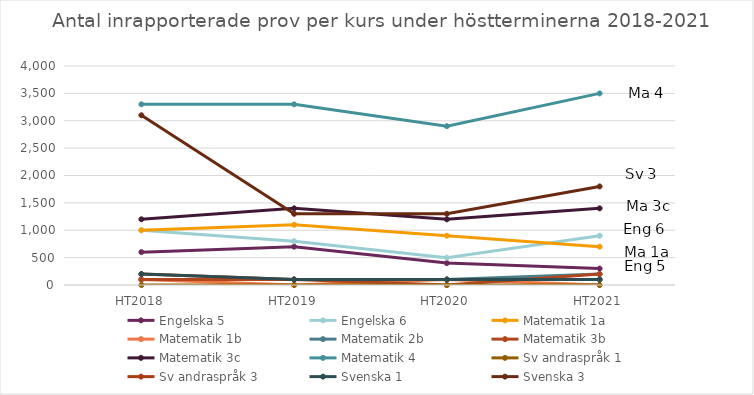
| Category | Engelska 5 | Engelska 6 | Matematik 1a | Matematik 1b | Matematik 2b | Matematik 3b | Matematik 3c | Matematik 4 | Sv andraspråk 1 | Sv andraspråk 3 | Svenska 1 | Svenska 3 |
|---|---|---|---|---|---|---|---|---|---|---|---|---|
| HT2018 | 600 | 1000 | 1000 | 100 | 100 | 100 | 1200 | 3300 | 0 | 200 | 200 | 3100 |
| HT2019 | 700 | 800 | 1100 | 0 | 100 | 100 | 1400 | 3300 | 0 | 100 | 100 | 1300 |
| HT2020 | 400 | 500 | 900 | 100 | 100 | 0 | 1200 | 2900 | 0 | 100 | 100 | 1300 |
| HT2021 | 300 | 900 | 700 | 0 | 200 | 200 | 1400 | 3500 | 0 | 100 | 100 | 1800 |